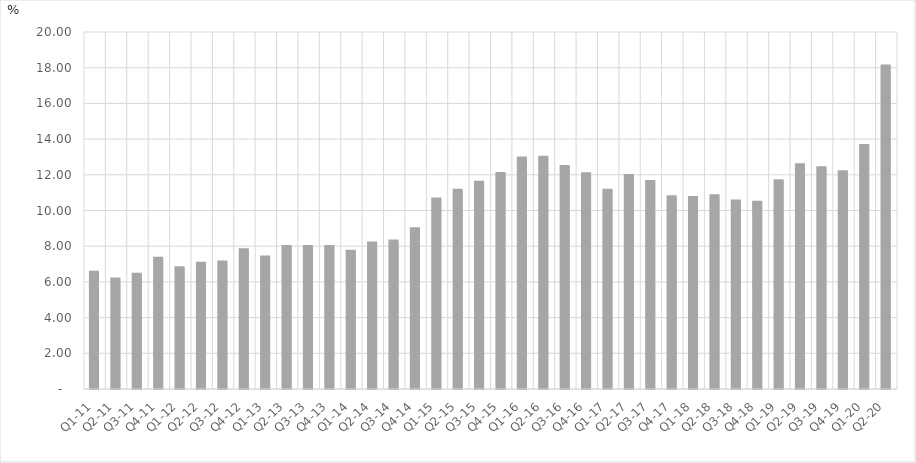
| Category | Percent of Total GDP |
|---|---|
| Q1-11 | 6.543 |
| Q2-11 | 6.156 |
| Q3-11 | 6.425 |
| Q4-11 | 7.326 |
| Q1-12 | 6.787 |
| Q2-12 | 7.044 |
| Q3-12 | 7.11 |
| Q4-12 | 7.804 |
| Q1-13 | 7.399 |
| Q2-13 | 7.977 |
| Q3-13 | 7.977 |
| Q4-13 | 7.982 |
| Q1-14 | 7.718 |
| Q2-14 | 8.174 |
| Q3-14 | 8.293 |
| Q4-14 | 8.971 |
| Q1-15 | 10.645 |
| Q2-15 | 11.137 |
| Q3-15 | 11.584 |
| Q4-15 | 12.067 |
| Q1-16 | 12.935 |
| Q2-16 | 12.985 |
| Q3-16 | 12.471 |
| Q4-16 | 12.065 |
| Q1-17 | 11.138 |
| Q2-17 | 11.963 |
| Q3-17 | 11.618 |
| Q4-17 | 10.771 |
| Q1-18 | 10.727 |
| Q2-18 | 10.824 |
| Q3-18 | 10.533 |
| Q4-18 | 10.456 |
| Q1-19 | 11.667 |
| Q2-19 | 12.563 |
| Q3-19 | 12.401 |
| Q4-19 | 12.167 |
| Q1-20 | 13.636 |
| Q2-20 | 18.1 |